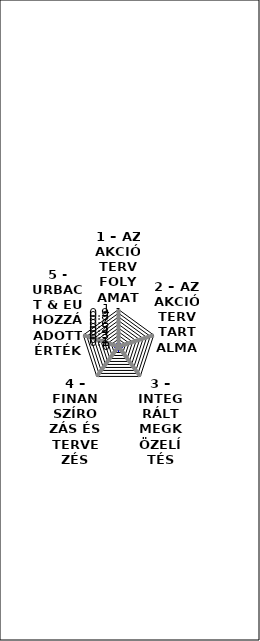
| Category | Átlagos pontszám a témában | Average score for theme |
|---|---|---|
| 1 – AZ AKCIÓTERV FOLYAMATA | 0 | 0 |
| 2 – AZ AKCIÓTERV TARTALMA | 0 | 0 |
| 3 – INTEGRÁLT MEGKÖZELÍTÉS | 0 | 0 |
| 4 – FINANSZÍROZÁS ÉS TERVEZÉS | 0 | 0 |
| 5 - URBACT & EU HOZZÁADOTT ÉRTÉK | 0 | 0 |